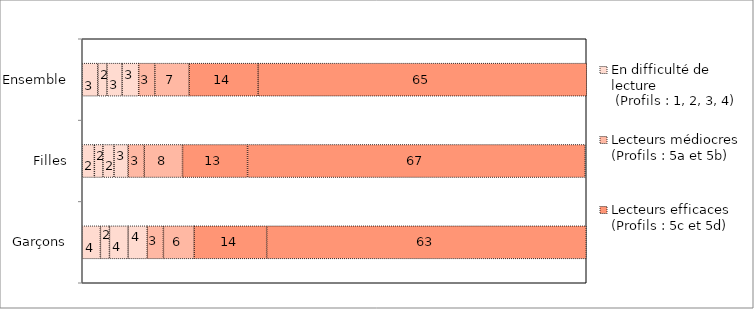
| Category | Series 7 | Series 6 | Series 5 | En difficulté de lecture
 (Profils : 1, 2, 3, 4) | Series 3 | Lecteurs médiocres
(Profils : 5a et 5b) | Series 1 | Lecteurs efficaces 
(Profils : 5c et 5d) |
|---|---|---|---|---|---|---|---|---|
| Garçons | 3.6 | 1.8 | 3.7 | 3.8 | 3.2 | 6.1 | 14.4 | 63.4 |
| Filles | 2.4 | 1.7 | 2.2 | 2.8 | 3.2 | 7.6 | 12.9 | 67 |
| Ensemble | 3.1 | 1.8 | 3 | 3.3 | 3.2 | 6.8 | 13.7 | 65.2 |